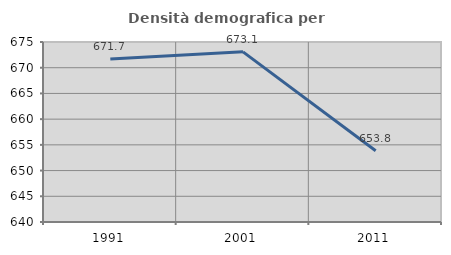
| Category | Densità demografica |
|---|---|
| 1991.0 | 671.673 |
| 2001.0 | 673.085 |
| 2011.0 | 653.848 |